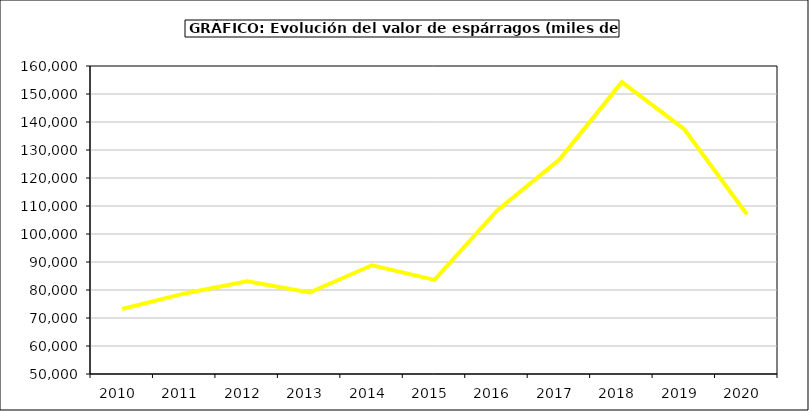
| Category | Valor |
|---|---|
| 2010.0 | 73215.082 |
| 2011.0 | 78781.277 |
| 2012.0 | 83128.666 |
| 2013.0 | 79103.985 |
| 2014.0 | 88833.6 |
| 2015.0 | 83613.501 |
| 2016.0 | 108300 |
| 2017.0 | 126575 |
| 2018.0 | 154241.925 |
| 2019.0 | 137405.283 |
| 2020.0 | 107060.102 |